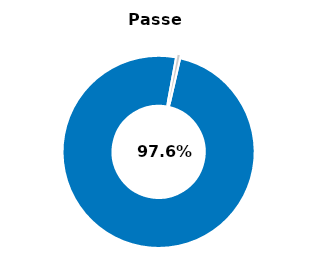
| Category | Series 0 |
|---|---|
| Passed | 0.993 |
| Other | 0.007 |